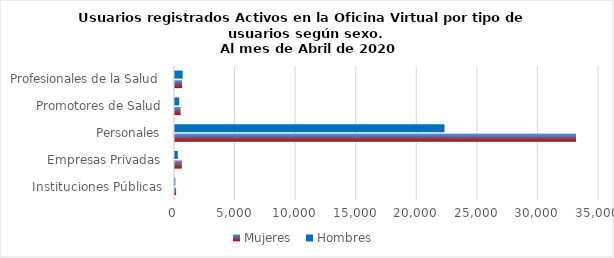
| Category | Mujeres | Hombres |
|---|---|---|
| Instituciones Públicas | 90 | 26 |
| Empresas Privadas | 564 | 228 |
| Personales | 33104 | 22245 |
| Promotores de Salud | 463 | 344 |
| Profesionales de la Salud | 576 | 631 |